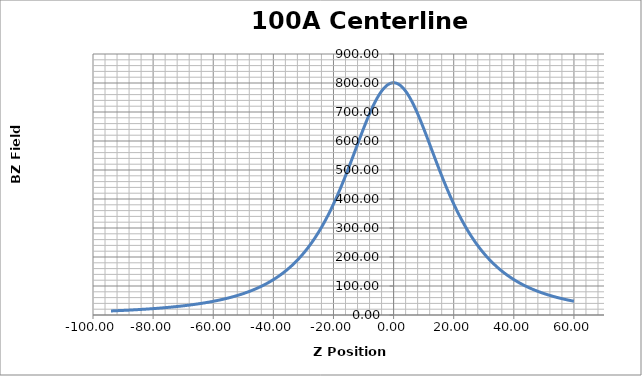
| Category | Series 0 |
|---|---|
| -94.002 | 13.97 |
| -93.801 | 14.08 |
| -93.60000000000001 | 14.16 |
| -93.403 | 14.25 |
| -93.203 | 14.35 |
| -93.002 | 14.43 |
| -92.802 | 14.52 |
| -92.605 | 14.57 |
| -92.405 | 14.7 |
| -92.20400000000001 | 14.79 |
| -92.004 | 14.91 |
| -91.806 | 14.97 |
| -91.604 | 15.1 |
| -91.402 | 15.18 |
| -91.203 | 15.27 |
| -91.005 | 15.32 |
| -90.803 | 15.45 |
| -90.602 | 15.56 |
| -90.402 | 15.65 |
| -90.205 | 15.75 |
| -90.004 | 15.83 |
| -89.804 | 15.93 |
| -89.605 | 16.02 |
| -89.408 | 16.14 |
| -89.205 | 16.27 |
| -89.003 | 16.32 |
| -88.802 | 16.45 |
| -88.605 | 16.54 |
| -88.403 | 16.64 |
| -88.202 | 16.76 |
| -88.00200000000001 | 16.84 |
| -87.805 | 16.95 |
| -87.604 | 17.08 |
| -87.404 | 17.19 |
| -87.205 | 17.32 |
| -87.007 | 17.41 |
| -86.806 | 17.52 |
| -86.60300000000001 | 17.65 |
| -86.402 | 17.78 |
| -86.206 | 17.91 |
| -86.004 | 18 |
| -85.803 | 18.11 |
| -85.60300000000001 | 18.2 |
| -85.405 | 18.36 |
| -85.205 | 18.47 |
| -85.003 | 18.55 |
| -84.805 | 18.71 |
| -84.608 | 18.83 |
| -84.407 | 18.95 |
| -84.205 | 19.13 |
| -84.003 | 19.22 |
| -83.806 | 19.35 |
| -83.604 | 19.47 |
| -83.402 | 19.6 |
| -83.202 | 19.75 |
| -83.005 | 19.89 |
| -82.805 | 19.98 |
| -82.604 | 20.14 |
| -82.404 | 20.27 |
| -82.208 | 20.4 |
| -82.007 | 20.54 |
| -81.805 | 20.69 |
| -81.604 | 20.84 |
| -81.407 | 20.98 |
| -81.206 | 21.12 |
| -81.004 | 21.27 |
| -80.804 | 21.42 |
| -80.606 | 21.58 |
| -80.405 | 21.69 |
| -80.20400000000001 | 21.85 |
| -80.005 | 21.97 |
| -79.808 | 22.14 |
| -79.608 | 22.3 |
| -79.407 | 22.47 |
| -79.206 | 22.61 |
| -79.00800000000001 | 22.74 |
| -78.806 | 22.9 |
| -78.605 | 23.1 |
| -78.404 | 23.27 |
| -78.20700000000001 | 23.43 |
| -78.006 | 23.58 |
| -77.805 | 23.75 |
| -77.605 | 23.91 |
| -77.40700000000001 | 24.1 |
| -77.208 | 24.24 |
| -77.007 | 24.41 |
| -76.806 | 24.6 |
| -76.60900000000001 | 24.78 |
| -76.40700000000001 | 24.99 |
| -76.205 | 25.17 |
| -76.004 | 25.33 |
| -75.806 | 25.51 |
| -75.606 | 25.73 |
| -75.404 | 25.86 |
| -75.205 | 26.05 |
| -75.007 | 26.24 |
| -74.807 | 26.44 |
| -74.605 | 26.64 |
| -74.406 | 26.81 |
| -74.208 | 27 |
| -74.007 | 27.2 |
| -73.805 | 27.42 |
| -73.605 | 27.63 |
| -73.408 | 27.81 |
| -73.207 | 28.05 |
| -73.005 | 28.26 |
| -72.804 | 28.43 |
| -72.607 | 28.64 |
| -72.40700000000001 | 28.87 |
| -72.206 | 29.11 |
| -72.006 | 29.29 |
| -71.809 | 29.54 |
| -71.608 | 29.78 |
| -71.406 | 29.96 |
| -71.20400000000001 | 30.2 |
| -71.006 | 30.41 |
| -70.805 | 30.66 |
| -70.604 | 30.88 |
| -70.404 | 31.14 |
| -70.207 | 31.37 |
| -70.007 | 31.6 |
| -69.805 | 31.87 |
| -69.606 | 32.1 |
| -69.408 | 32.35 |
| -69.208 | 32.55 |
| -69.005 | 32.82 |
| -68.805 | 33.09 |
| -68.607 | 33.34 |
| -68.40700000000001 | 33.59 |
| -68.205 | 33.85 |
| -68.005 | 34.12 |
| -67.806 | 34.38 |
| -67.606 | 34.65 |
| -67.405 | 34.94 |
| -67.205 | 35.24 |
| -67.009 | 35.48 |
| -66.809 | 35.75 |
| -66.608 | 36.06 |
| -66.40700000000001 | 36.31 |
| -66.209 | 36.61 |
| -66.007 | 36.93 |
| -65.804 | 37.23 |
| -65.60300000000001 | 37.52 |
| -65.406 | 37.81 |
| -65.207 | 38.1 |
| -65.005 | 38.4 |
| -64.805 | 38.7 |
| -64.60900000000001 | 39 |
| -64.409 | 39.35 |
| -64.208 | 39.64 |
| -64.006 | 39.96 |
| -63.80800000000001 | 40.29 |
| -63.607 | 40.63 |
| -63.405 | 40.98 |
| -63.205 | 41.3 |
| -63.007000000000005 | 41.61 |
| -62.807 | 41.96 |
| -62.606 | 42.34 |
| -62.405 | 42.71 |
| -62.207 | 43.01 |
| -62.008 | 43.42 |
| -61.808 | 43.76 |
| -61.607 | 44.16 |
| -61.410000000000004 | 44.5 |
| -61.209 | 44.9 |
| -61.005 | 45.26 |
| -60.804 | 45.62 |
| -60.606 | 46.01 |
| -60.406 | 46.38 |
| -60.205000000000005 | 46.8 |
| -60.004000000000005 | 47.17 |
| -59.808 | 47.59 |
| -59.609 | 47.99 |
| -59.408 | 48.39 |
| -59.208000000000006 | 48.8 |
| -59.010000000000005 | 49.24 |
| -58.809000000000005 | 49.65 |
| -58.606 | 50.08 |
| -58.405 | 50.47 |
| -58.207 | 50.93 |
| -58.008 | 51.37 |
| -57.805 | 51.83 |
| -57.604 | 52.29 |
| -57.406 | 52.74 |
| -57.207 | 53.19 |
| -57.006 | 53.68 |
| -56.807 | 54.13 |
| -56.61 | 54.62 |
| -56.411 | 55.1 |
| -56.208000000000006 | 55.6 |
| -56.006 | 56.12 |
| -55.807 | 56.59 |
| -55.607 | 57.1 |
| -55.406 | 57.6 |
| -55.205000000000005 | 58.15 |
| -55.007000000000005 | 58.62 |
| -54.809000000000005 | 59.16 |
| -54.608000000000004 | 59.71 |
| -54.406 | 60.26 |
| -54.209 | 60.79 |
| -54.010000000000005 | 61.34 |
| -53.809000000000005 | 61.89 |
| -53.608000000000004 | 62.44 |
| -53.409 | 63.01 |
| -53.209 | 63.57 |
| -53.006 | 64.17 |
| -52.804 | 64.76 |
| -52.606 | 65.38 |
| -52.407000000000004 | 65.94 |
| -52.207 | 66.58 |
| -52.007000000000005 | 67.22 |
| -51.81 | 67.84 |
| -51.611000000000004 | 68.46 |
| -51.409 | 69.12 |
| -51.207 | 69.73 |
| -51.008 | 70.42 |
| -50.808 | 71.07 |
| -50.607 | 71.77 |
| -50.406 | 72.44 |
| -50.208000000000006 | 73.12 |
| -50.008 | 73.81 |
| -49.806000000000004 | 74.5 |
| -49.605000000000004 | 75.23 |
| -49.408 | 75.92 |
| -49.21 | 76.66 |
| -49.009 | 77.39 |
| -48.808 | 78.15 |
| -48.609 | 78.9 |
| -48.408 | 79.66 |
| -48.206 | 80.45 |
| -48.004000000000005 | 81.22 |
| -47.807 | 81.98 |
| -47.608000000000004 | 82.82 |
| -47.406 | 83.62 |
| -47.205000000000005 | 84.42 |
| -47.008 | 85.23 |
| -46.809000000000005 | 86.09 |
| -46.607 | 86.94 |
| -46.407000000000004 | 87.81 |
| -46.209 | 88.68 |
| -46.010000000000005 | 89.56 |
| -45.808 | 90.44 |
| -45.606 | 91.34 |
| -45.407000000000004 | 92.25 |
| -45.207 | 93.19 |
| -45.005 | 94.16 |
| -44.805 | 95.1 |
| -44.607 | 96.07 |
| -44.408 | 97.02 |
| -44.207 | 98.01 |
| -44.007000000000005 | 99.01 |
| -43.81 | 99.99 |
| -43.611000000000004 | 101.01 |
| -43.407000000000004 | 102.04 |
| -43.205000000000005 | 103.13 |
| -43.006 | 104.17 |
| -42.807 | 105.25 |
| -42.606 | 106.32 |
| -42.405 | 107.44 |
| -42.208000000000006 | 108.52 |
| -42.009 | 109.68 |
| -41.808 | 110.81 |
| -41.606 | 112 |
| -41.407000000000004 | 113.17 |
| -41.209 | 114.38 |
| -41.008 | 115.55 |
| -40.807 | 116.78 |
| -40.607 | 117.98 |
| -40.409 | 119.23 |
| -40.206 | 120.52 |
| -40.004000000000005 | 121.83 |
| -39.805 | 123.11 |
| -39.607 | 124.42 |
| -39.407000000000004 | 125.72 |
| -39.207 | 127.08 |
| -39.009 | 128.44 |
| -38.811 | 129.79 |
| -38.608000000000004 | 131.26 |
| -38.406 | 132.64 |
| -38.205000000000005 | 134.1 |
| -38.007000000000005 | 135.55 |
| -37.806000000000004 | 136.99 |
| -37.605000000000004 | 138.51 |
| -37.406 | 140.02 |
| -37.208000000000006 | 141.54 |
| -37.007000000000005 | 143.09 |
| -36.805 | 144.68 |
| -36.606 | 146.24 |
| -36.409 | 147.87 |
| -36.208000000000006 | 149.49 |
| -36.007000000000005 | 151.18 |
| -35.807 | 152.82 |
| -35.608000000000004 | 154.53 |
| -35.406 | 156.25 |
| -35.204 | 158.01 |
| -35.004000000000005 | 159.78 |
| -34.807 | 161.54 |
| -34.606 | 163.39 |
| -34.405 | 165.22 |
| -34.207 | 167.07 |
| -34.010000000000005 | 168.9 |
| -33.808 | 170.86 |
| -33.606 | 172.81 |
| -33.406 | 174.79 |
| -33.209 | 176.74 |
| -33.007000000000005 | 178.76 |
| -32.806000000000004 | 180.79 |
| -32.607 | 182.86 |
| -32.409 | 184.95 |
| -32.207 | 187.06 |
| -32.006 | 189.23 |
| -31.807000000000002 | 191.37 |
| -31.609 | 193.59 |
| -31.410000000000004 | 195.79 |
| -31.208000000000006 | 198.11 |
| -31.009 | 200.39 |
| -30.811 | 202.67 |
| -30.609 | 205.05 |
| -30.407000000000004 | 207.44 |
| -30.208000000000006 | 209.86 |
| -30.010000000000005 | 212.29 |
| -29.808999999999997 | 214.77 |
| -29.607 | 217.33 |
| -29.408 | 219.83 |
| -29.210000000000008 | 222.41 |
| -29.009 | 225.01 |
| -28.808000000000007 | 227.67 |
| -28.60900000000001 | 230.32 |
| -28.411 | 233.01 |
| -28.209000000000003 | 235.76 |
| -28.007000000000005 | 238.56 |
| -27.808000000000007 | 241.37 |
| -27.61 | 244.21 |
| -27.408 | 247.14 |
| -27.207000000000008 | 250.07 |
| -27.007000000000005 | 253.03 |
| -26.810000000000002 | 255.99 |
| -26.60900000000001 | 259 |
| -26.408 | 262.14 |
| -26.209000000000003 | 265.19 |
| -26.010999999999996 | 268.31 |
| -25.810000000000002 | 271.53 |
| -25.608000000000004 | 274.77 |
| -25.408 | 278.06 |
| -25.210000000000008 | 281.35 |
| -25.009 | 284.69 |
| -24.807000000000002 | 288.11 |
| -24.607 | 291.55 |
| -24.409000000000006 | 294.94 |
| -24.208 | 298.49 |
| -24.007000000000005 | 302.06 |
| -23.808000000000007 | 305.63 |
| -23.611000000000004 | 309.22 |
| -23.409999999999997 | 312.93 |
| -23.208 | 316.7 |
| -23.007999999999996 | 320.48 |
| -22.810000000000002 | 324.26 |
| -22.60900000000001 | 328.11 |
| -22.406999999999996 | 332.09 |
| -22.207000000000008 | 336 |
| -22.009 | 339.94 |
| -21.808000000000007 | 344.02 |
| -21.607 | 348.1 |
| -21.408 | 352.19 |
| -21.211 | 356.31 |
| -21.010000000000005 | 360.51 |
| -20.808999999999997 | 364.8 |
| -20.60900000000001 | 369.12 |
| -20.409999999999997 | 373.42 |
| -20.209000000000003 | 377.83 |
| -20.007000000000005 | 382.31 |
| -19.808000000000007 | 386.76 |
| -19.61 | 391.26 |
| -19.408 | 395.86 |
| -19.206000000000003 | 400.47 |
| -19.007000000000005 | 405.14 |
| -18.810000000000002 | 409.72 |
| -18.61 | 414.49 |
| -18.408 | 419.25 |
| -18.208 | 424.09 |
| -18.010000000000005 | 428.89 |
| -17.808999999999997 | 433.79 |
| -17.607 | 438.8 |
| -17.406999999999996 | 443.73 |
| -17.209000000000003 | 448.69 |
| -17.007999999999996 | 453.75 |
| -16.805999999999997 | 458.87 |
| -16.60600000000001 | 463.98 |
| -16.409000000000006 | 469.07 |
| -16.209000000000003 | 474.27 |
| -16.007999999999996 | 479.48 |
| -15.808000000000007 | 484.73 |
| -15.61 | 489.97 |
| -15.409000000000006 | 495.31 |
| -15.207000000000008 | 500.67 |
| -15.007000000000005 | 506.05 |
| -14.808999999999997 | 511.39 |
| -14.608000000000004 | 516.77 |
| -14.406000000000006 | 522.26 |
| -14.206000000000003 | 527.75 |
| -14.009 | 533.08 |
| -13.808999999999997 | 538.56 |
| -13.607 | 544.11 |
| -13.406999999999996 | 549.61 |
| -13.209000000000003 | 555.08 |
| -13.007999999999996 | 560.61 |
| -12.805999999999997 | 566.22 |
| -12.606000000000009 | 571.76 |
| -12.409000000000006 | 577.24 |
| -12.207999999999998 | 582.77 |
| -12.006 | 588.29 |
| -11.805999999999997 | 593.83 |
| -11.609000000000009 | 599.28 |
| -11.406999999999996 | 604.82 |
| -11.206000000000003 | 610.33 |
| -11.006 | 615.76 |
| -10.808999999999997 | 621.13 |
| -10.608000000000004 | 626.55 |
| -10.406000000000006 | 632.02 |
| -10.206000000000003 | 637.4 |
| -10.007999999999996 | 642.63 |
| -9.808000000000007 | 647.94 |
| -9.606000000000009 | 653.25 |
| -9.406000000000006 | 658.45 |
| -9.207999999999998 | 663.59 |
| -9.007000000000005 | 668.75 |
| -8.805999999999997 | 673.83 |
| -8.606000000000009 | 678.82 |
| -8.409000000000006 | 683.7 |
| -8.207999999999998 | 688.62 |
| -8.006 | 693.5 |
| -7.805999999999997 | 698.25 |
| -7.608000000000004 | 702.88 |
| -7.4069999999999965 | 707.54 |
| -7.206000000000003 | 712.13 |
| -7.006 | 716.6 |
| -6.808000000000007 | 720.89 |
| -6.606999999999999 | 725.23 |
| -6.4069999999999965 | 729.44 |
| -6.206000000000003 | 733.56 |
| -6.010000000000005 | 737.5 |
| -5.8089999999999975 | 741.42 |
| -5.606999999999999 | 745.24 |
| -5.406000000000006 | 748.98 |
| -5.209000000000003 | 752.54 |
| -5.007999999999996 | 756.01 |
| -4.805999999999997 | 759.43 |
| -4.606000000000009 | 762.71 |
| -4.408000000000001 | 765.75 |
| -4.207999999999998 | 768.79 |
| -4.006 | 771.73 |
| -3.8059999999999974 | 774.46 |
| -3.609000000000009 | 777.07 |
| -3.409000000000006 | 779.6 |
| -3.207000000000008 | 782.01 |
| -3.0060000000000002 | 784.23 |
| -2.8089999999999975 | 786.33 |
| -2.608000000000004 | 788.3 |
| -2.406000000000006 | 790.14 |
| -2.206000000000003 | 791.84 |
| -2.0090000000000003 | 793.38 |
| -1.808000000000007 | 794.79 |
| -1.6060000000000088 | 796.07 |
| -1.406000000000006 | 797.2 |
| -1.2090000000000032 | 798.14 |
| -1.0090000000000003 | 798.95 |
| -0.8080000000000069 | 799.61 |
| -0.6069999999999993 | 800.13 |
| -0.409000000000006 | 800.51 |
| -0.2079999999999984 | 800.72 |
| -0.006000000000000227 | 800.84 |
| 0.19400000000000261 | 800.76 |
| 0.3919999999999959 | 800.59 |
| 0.5919999999999987 | 800.19 |
| 0.7929999999999922 | 799.69 |
| 0.9939999999999998 | 799.03 |
| 1.1910000000000025 | 798.24 |
| 1.3909999999999911 | 797.3 |
| 1.5930000000000035 | 796.18 |
| 1.7929999999999922 | 794.93 |
| 1.9909999999999997 | 793.56 |
| 2.1910000000000025 | 792.01 |
| 2.3930000000000007 | 790.33 |
| 2.593999999999994 | 788.53 |
| 2.790999999999997 | 786.62 |
| 2.9909999999999997 | 784.53 |
| 3.192999999999998 | 782.28 |
| 3.394999999999996 | 779.91 |
| 3.5930000000000035 | 777.45 |
| 3.7920000000000016 | 774.84 |
| 3.9939999999999998 | 772.12 |
| 4.194000000000003 | 769.21 |
| 4.390000000000001 | 766.28 |
| 4.590999999999994 | 763.16 |
| 4.792000000000002 | 759.89 |
| 4.992999999999995 | 756.53 |
| 5.191999999999993 | 753.09 |
| 5.391999999999996 | 749.51 |
| 5.593999999999994 | 745.8 |
| 5.795000000000002 | 742.01 |
| 5.992000000000004 | 738.18 |
| 6.191999999999993 | 734.15 |
| 6.393000000000001 | 730.06 |
| 6.593999999999994 | 725.85 |
| 6.792000000000002 | 721.65 |
| 6.991 | 717.28 |
| 7.192999999999998 | 712.83 |
| 7.393999999999991 | 708.24 |
| 7.591999999999999 | 703.69 |
| 7.792000000000002 | 699.01 |
| 7.994 | 694.23 |
| 8.194000000000003 | 689.4 |
| 8.393 | 684.54 |
| 8.591999999999999 | 679.66 |
| 8.792999999999992 | 674.59 |
| 8.994 | 669.5 |
| 9.191999999999993 | 664.44 |
| 9.390999999999991 | 659.3 |
| 9.593000000000004 | 654.02 |
| 9.793999999999997 | 648.74 |
| 9.992000000000004 | 643.51 |
| 10.191999999999993 | 638.22 |
| 10.393 | 632.8 |
| 10.593999999999994 | 627.41 |
| 10.792000000000002 | 622.06 |
| 10.992000000000004 | 616.61 |
| 11.192999999999998 | 611.13 |
| 11.393999999999991 | 605.63 |
| 11.590999999999994 | 600.21 |
| 11.790999999999997 | 594.73 |
| 11.992999999999995 | 589.18 |
| 12.192999999999998 | 583.65 |
| 12.390999999999991 | 578.15 |
| 12.591999999999999 | 572.64 |
| 12.792999999999992 | 567.08 |
| 12.994 | 561.54 |
| 13.191999999999993 | 556.04 |
| 13.390999999999991 | 550.56 |
| 13.593000000000004 | 545.02 |
| 13.793999999999997 | 539.53 |
| 13.992000000000004 | 534.13 |
| 14.191000000000003 | 528.68 |
| 14.391999999999996 | 523.19 |
| 14.593999999999994 | 517.76 |
| 14.790999999999997 | 512.41 |
| 14.991 | 507.07 |
| 15.192999999999998 | 501.65 |
| 15.393999999999991 | 496.3 |
| 15.591999999999999 | 491.07 |
| 15.790999999999997 | 485.8 |
| 15.992999999999995 | 480.51 |
| 16.194000000000003 | 475.25 |
| 16.391999999999996 | 470.14 |
| 16.590999999999994 | 465.02 |
| 16.792999999999992 | 459.88 |
| 16.992999999999995 | 454.75 |
| 17.191000000000003 | 449.77 |
| 17.39 | 444.79 |
| 17.593000000000004 | 439.76 |
| 17.793999999999997 | 434.79 |
| 17.992000000000004 | 429.95 |
| 18.191000000000003 | 425.1 |
| 18.393 | 420.29 |
| 18.593000000000004 | 415.48 |
| 18.790999999999997 | 410.78 |
| 18.989999999999995 | 406.14 |
| 19.191999999999993 | 401.44 |
| 19.391999999999996 | 396.84 |
| 19.590000000000003 | 392.34 |
| 19.789 | 387.82 |
| 19.992000000000004 | 383.31 |
| 20.192999999999998 | 378.85 |
| 20.39099999999999 | 374.51 |
| 20.590000000000003 | 370.17 |
| 20.792 | 365.87 |
| 20.992999999999995 | 361.61 |
| 21.191000000000003 | 357.42 |
| 21.39 | 353.25 |
| 21.590999999999994 | 349.14 |
| 21.792 | 345.02 |
| 21.989999999999995 | 341.03 |
| 22.188999999999993 | 337.04 |
| 22.39099999999999 | 333.07 |
| 22.593000000000004 | 329.15 |
| 22.790999999999997 | 325.31 |
| 22.989999999999995 | 321.49 |
| 23.191000000000003 | 317.74 |
| 23.393 | 313.94 |
| 23.590999999999994 | 310.31 |
| 23.789999999999992 | 306.62 |
| 23.992000000000004 | 303 |
| 24.192999999999998 | 299.42 |
| 24.39099999999999 | 295.96 |
| 24.589 | 292.49 |
| 24.790999999999997 | 289.03 |
| 24.992000000000004 | 285.61 |
| 25.191000000000003 | 282.25 |
| 25.39 | 278.95 |
| 25.592 | 275.69 |
| 25.792999999999992 | 272.43 |
| 25.991 | 269.25 |
| 26.189999999999998 | 266.11 |
| 26.391999999999996 | 262.99 |
| 26.593000000000004 | 259.91 |
| 26.790999999999997 | 256.89 |
| 26.989999999999995 | 253.9 |
| 27.191999999999993 | 250.88 |
| 27.393 | 247.95 |
| 27.590999999999994 | 245.09 |
| 27.790999999999997 | 242.23 |
| 27.992000000000004 | 239.38 |
| 28.192999999999998 | 236.6 |
| 28.39099999999999 | 233.86 |
| 28.590000000000003 | 231.16 |
| 28.792 | 228.43 |
| 28.992999999999995 | 225.79 |
| 29.192999999999998 | 223.17 |
| 29.39099999999999 | 220.62 |
| 29.592 | 218.04 |
| 29.793999999999997 | 215.55 |
| 29.992999999999995 | 213.07 |
| 30.191000000000003 | 210.61 |
| 30.393 | 208.18 |
| 30.593999999999994 | 205.75 |
| 30.792999999999992 | 203.41 |
| 30.991 | 201.14 |
| 31.191999999999993 | 198.82 |
| 31.393 | 196.53 |
| 31.593000000000004 | 194.3 |
| 31.790999999999997 | 192.12 |
| 31.992999999999995 | 189.89 |
| 32.194 | 187.75 |
| 32.393 | 185.61 |
| 32.590999999999994 | 183.55 |
| 32.79299999999999 | 181.46 |
| 32.994 | 179.4 |
| 33.193 | 177.42 |
| 33.39099999999999 | 175.44 |
| 33.592 | 173.47 |
| 33.794 | 171.51 |
| 33.992999999999995 | 169.54 |
| 34.191 | 167.72 |
| 34.393 | 165.82 |
| 34.593999999999994 | 163.94 |
| 34.79400000000001 | 162.13 |
| 34.990999999999985 | 160.35 |
| 35.192999999999984 | 158.57 |
| 35.39500000000001 | 156.82 |
| 35.593999999999994 | 155.09 |
| 35.791 | 153.44 |
| 35.99199999999999 | 151.74 |
| 36.19399999999999 | 150.06 |
| 36.393 | 148.43 |
| 36.59100000000001 | 146.81 |
| 36.793000000000006 | 145.23 |
| 36.995000000000005 | 143.66 |
| 37.19399999999999 | 142.09 |
| 37.391999999999996 | 140.55 |
| 37.593999999999994 | 139.03 |
| 37.79599999999999 | 137.53 |
| 37.995000000000005 | 136.04 |
| 38.19200000000001 | 134.58 |
| 38.393 | 133.15 |
| 38.593999999999994 | 131.73 |
| 38.79400000000001 | 130.3 |
| 38.99199999999999 | 128.93 |
| 39.192999999999984 | 127.56 |
| 39.39500000000001 | 126.19 |
| 39.595 | 124.86 |
| 39.793000000000006 | 123.57 |
| 39.994 | 122.25 |
| 40.196 | 120.94 |
| 40.39599999999999 | 119.68 |
| 40.59299999999999 | 118.43 |
| 40.79400000000001 | 117.21 |
| 40.995000000000005 | 115.95 |
| 41.19499999999999 | 114.75 |
| 41.391999999999996 | 113.57 |
| 41.59299999999999 | 112.41 |
| 41.79499999999999 | 111.23 |
| 41.995000000000005 | 110.09 |
| 42.192999999999984 | 108.97 |
| 42.394000000000005 | 107.84 |
| 42.596000000000004 | 106.72 |
| 42.79599999999999 | 105.64 |
| 42.992999999999995 | 104.53 |
| 43.19399999999999 | 103.5 |
| 43.39500000000001 | 102.45 |
| 43.59299999999999 | 101.43 |
| 43.791 | 100.41 |
| 43.99199999999999 | 99.4 |
| 44.19399999999999 | 98.36 |
| 44.394000000000005 | 97.42 |
| 44.59100000000001 | 96.42 |
| 44.793000000000006 | 95.47 |
| 44.995000000000005 | 94.51 |
| 45.19399999999999 | 93.54 |
| 45.391999999999996 | 92.6 |
| 45.59299999999999 | 91.7 |
| 45.79400000000001 | 90.76 |
| 45.994 | 89.92 |
| 46.191 | 89.03 |
| 46.391999999999996 | 88.16 |
| 46.593999999999994 | 87.3 |
| 46.79400000000001 | 86.45 |
| 46.990999999999985 | 85.61 |
| 47.19200000000001 | 84.73 |
| 47.394000000000005 | 83.92 |
| 47.595 | 83.12 |
| 47.792 | 82.34 |
| 47.992999999999995 | 81.53 |
| 48.19499999999999 | 80.74 |
| 48.394000000000005 | 79.96 |
| 48.59100000000001 | 79.22 |
| 48.792 | 78.47 |
| 48.994 | 77.71 |
| 49.19399999999999 | 76.95 |
| 49.391999999999996 | 76.26 |
| 49.591999999999985 | 75.54 |
| 49.79400000000001 | 74.83 |
| 49.995000000000005 | 74.14 |
| 50.19200000000001 | 73.43 |
| 50.394000000000005 | 72.72 |
| 50.595 | 72.06 |
| 50.79400000000001 | 71.34 |
| 50.99199999999999 | 70.74 |
| 51.19200000000001 | 70.07 |
| 51.394000000000005 | 69.41 |
| 51.593999999999994 | 68.75 |
| 51.791 | 68.12 |
| 51.99199999999999 | 67.52 |
| 52.19399999999999 | 66.88 |
| 52.394000000000005 | 66.29 |
| 52.591999999999985 | 65.69 |
| 52.79400000000001 | 65.05 |
| 52.995000000000005 | 64.5 |
| 53.19499999999999 | 63.89 |
| 53.391999999999996 | 63.32 |
| 53.59299999999999 | 62.75 |
| 53.79400000000001 | 62.2 |
| 53.994 | 61.63 |
| 54.19200000000001 | 61.09 |
| 54.393 | 60.53 |
| 54.593999999999994 | 60 |
| 54.79499999999999 | 59.45 |
| 54.99199999999999 | 58.91 |
| 55.192999999999984 | 58.4 |
| 55.39500000000001 | 57.88 |
| 55.595 | 57.37 |
| 55.792 | 56.87 |
| 55.99199999999999 | 56.35 |
| 56.19399999999999 | 55.85 |
| 56.394000000000005 | 55.39 |
| 56.591999999999985 | 54.88 |
| 56.793000000000006 | 54.43 |
| 56.994 | 53.94 |
| 57.19399999999999 | 53.5 |
| 57.39099999999999 | 53.03 |
| 57.59299999999999 | 52.56 |
| 57.79499999999999 | 52.12 |
| 57.995000000000005 | 51.66 |
| 58.19200000000001 | 51.22 |
| 58.393 | 50.79 |
| 58.595 | 50.34 |
| 58.79499999999999 | 49.92 |
| 58.99199999999999 | 49.53 |
| 59.192999999999984 | 49.11 |
| 59.394000000000005 | 48.68 |
| 59.595 | 48.24 |
| 59.793000000000006 | 47.86 |
| 59.992999999999995 | 47.46 |